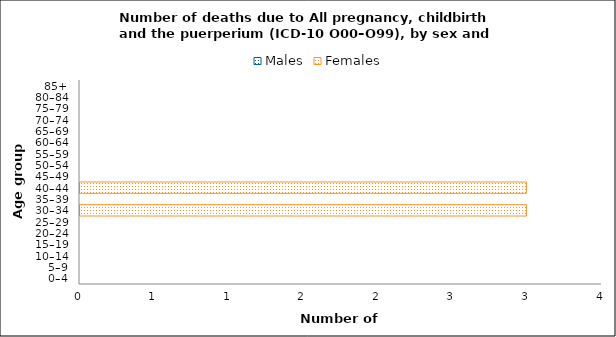
| Category | Males | Females |
|---|---|---|
| 0–4 | 0 | 0 |
| 5–9 | 0 | 0 |
| 10–14 | 0 | 0 |
| 15–19 | 0 | 0 |
| 20–24 | 0 | 0 |
| 25–29 | 0 | 0 |
| 30–34 | 0 | 3 |
| 35–39 | 0 | 0 |
| 40–44 | 0 | 3 |
| 45–49 | 0 | 0 |
| 50–54 | 0 | 0 |
| 55–59 | 0 | 0 |
| 60–64 | 0 | 0 |
| 65–69 | 0 | 0 |
| 70–74 | 0 | 0 |
| 75–79 | 0 | 0 |
| 80–84 | 0 | 0 |
| 85+ | 0 | 0 |